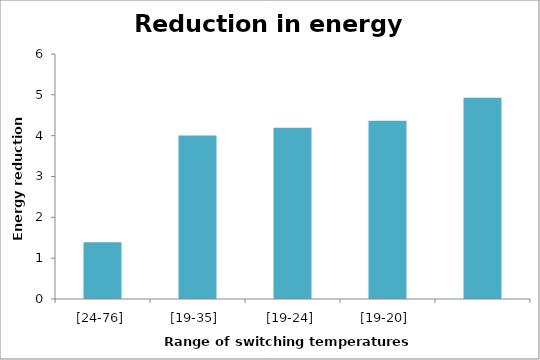
| Category | Series 0 |
|---|---|
| [24-76] | 1.391 |
| [19-35] | 4.003 |
| [19-24] | 4.192 |
| [19-20] | 4.364 |